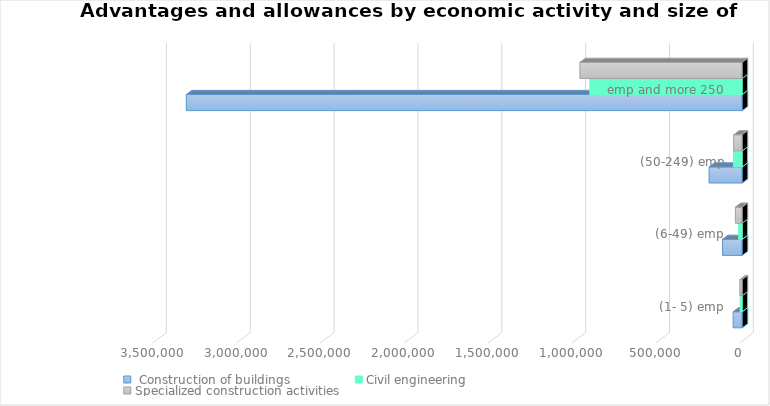
| Category |  Construction of buildings | Civil engineering | Specialized construction activities |
|---|---|---|---|
|  (1- 5) emp  | 54138 | 12617 | 14250 |
|  (6-49) emp  | 117458 | 21607 | 40836 |
|  (50-249) emp  | 198084 | 51948 | 51189 |
|  emp and more 250  | 3315248 | 909023 | 968189 |